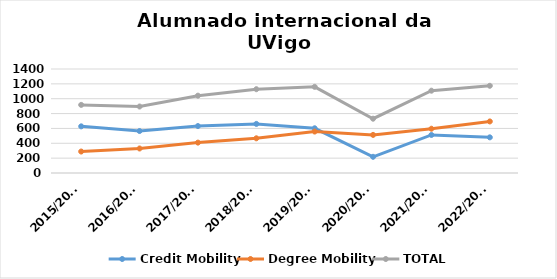
| Category | Credit Mobility | Degree Mobility | TOTAL |
|---|---|---|---|
| 2015/2016 | 628 | 289 | 917 |
| 2016/2017 | 565 | 330 | 895 |
| 2017/2018 | 632 | 409 | 1041 |
| 2018/2019 | 661 | 467 | 1128 |
| 2019/2020 | 602 | 558 | 1160 |
| 2020/2021 | 218 | 513 | 731 |
| 2021/2022 | 512 | 596 | 1108 |
| 2022/2023 | 480 | 694 | 1174 |